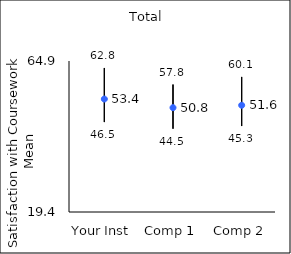
| Category | 25th percentile | 75th percentile | Mean |
|---|---|---|---|
| Your Inst | 46.5 | 62.8 | 53.44 |
| Comp 1 | 44.5 | 57.8 | 50.84 |
| Comp 2 | 45.3 | 60.1 | 51.56 |